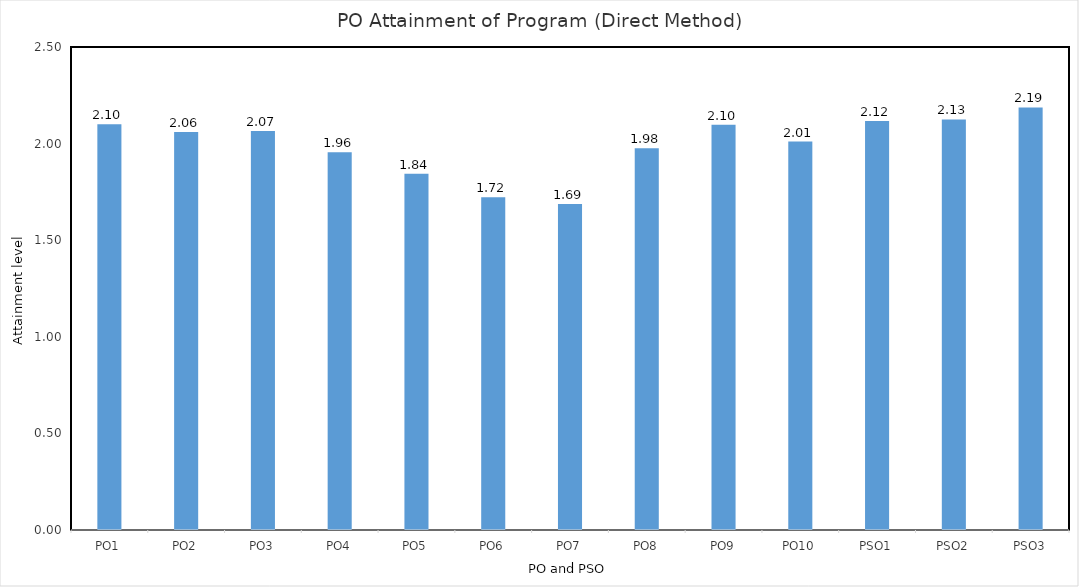
| Category | PO1 |
|---|---|
| PO1 | 2.1 |
| PO2 | 2.061 |
| PO3 | 2.065 |
| PO4 | 1.956 |
| PO5 | 1.844 |
| PO6 | 1.723 |
| PO7 | 1.687 |
| PO8 | 1.976 |
| PO9 | 2.097 |
| PO10 | 2.01 |
| PSO1 | 2.117 |
| PSO2 | 2.125 |
| PSO3 | 2.187 |